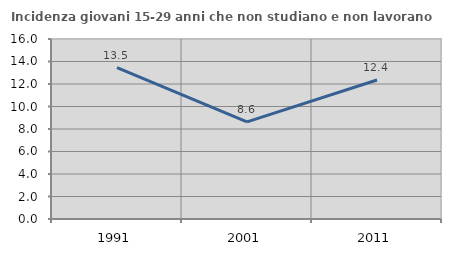
| Category | Incidenza giovani 15-29 anni che non studiano e non lavorano  |
|---|---|
| 1991.0 | 13.462 |
| 2001.0 | 8.636 |
| 2011.0 | 12.356 |